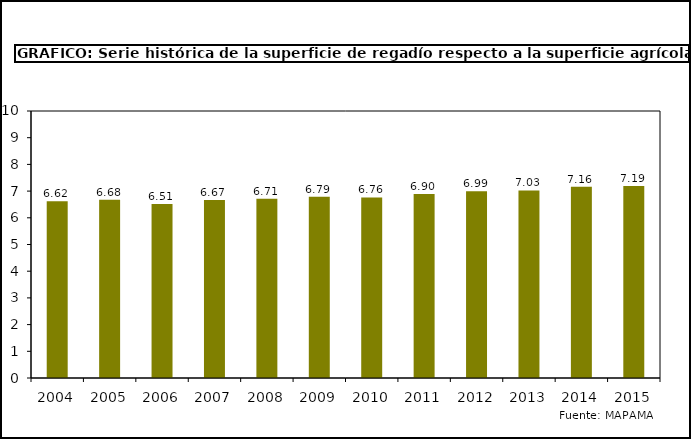
| Category | Series 2 |
|---|---|
| 2004.0 | 6.618 |
| 2005.0 | 6.676 |
| 2006.0 | 6.514 |
| 2007.0 | 6.671 |
| 2008.0 | 6.714 |
| 2009.0 | 6.785 |
| 2010.0 | 6.762 |
| 2011.0 | 6.896 |
| 2012.0 | 6.992 |
| 2013.0 | 7.027 |
| 2014.0 | 7.158 |
| 2015.0 | 7.191 |